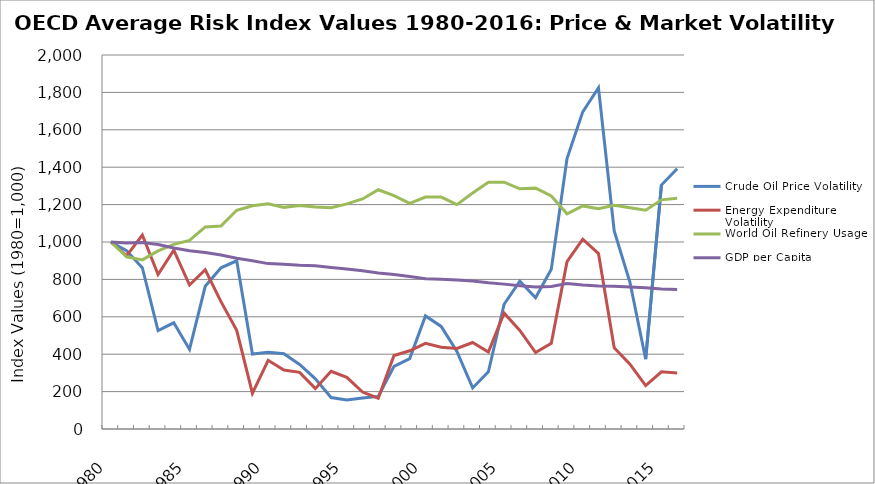
| Category | Crude Oil Price Volatility | Energy Expenditure Volatility | World Oil Refinery Usage | GDP per Capita |
|---|---|---|---|---|
| 1980.0 | 1000 | 1000 | 1000 | 1000 |
| 1981.0 | 953.916 | 925.77 | 920.829 | 994.044 |
| 1982.0 | 862.398 | 1037.249 | 904.555 | 996.844 |
| 1983.0 | 526.431 | 826.283 | 952.628 | 986.886 |
| 1984.0 | 567.974 | 956.754 | 987.079 | 968.412 |
| 1985.0 | 425.535 | 769.851 | 1008.263 | 953.72 |
| 1986.0 | 763.121 | 851.651 | 1080.818 | 943.396 |
| 1987.0 | 861.791 | 681.185 | 1085.462 | 930.903 |
| 1988.0 | 899.666 | 527.476 | 1169.688 | 913.213 |
| 1989.0 | 401.012 | 191.341 | 1194.01 | 899.502 |
| 1990.0 | 410.366 | 367.346 | 1204.902 | 884.449 |
| 1991.0 | 402.585 | 315.634 | 1185.253 | 881.232 |
| 1992.0 | 344.916 | 302.865 | 1194.546 | 875.65 |
| 1993.0 | 268.287 | 215.833 | 1187.561 | 873.465 |
| 1994.0 | 168.252 | 308.366 | 1183.386 | 863.718 |
| 1995.0 | 155.619 | 275.932 | 1203.818 | 855.055 |
| 1996.0 | 166.341 | 197.601 | 1229.978 | 845.744 |
| 1997.0 | 174.477 | 164.82 | 1279.495 | 834.421 |
| 1998.0 | 335.249 | 393.062 | 1248.329 | 826.328 |
| 1999.0 | 376.729 | 418.281 | 1206.159 | 815.903 |
| 2000.0 | 604.661 | 458.023 | 1240.088 | 802.958 |
| 2001.0 | 548.492 | 437.269 | 1240.466 | 800.257 |
| 2002.0 | 414.918 | 430.652 | 1199.96 | 796.819 |
| 2003.0 | 219.555 | 462.531 | 1261.571 | 791.777 |
| 2004.0 | 305.879 | 411.263 | 1319.937 | 782.209 |
| 2005.0 | 667.108 | 619.555 | 1320.154 | 774.759 |
| 2006.0 | 790.236 | 527.21 | 1284.48 | 766.242 |
| 2007.0 | 701.75 | 408.954 | 1288.043 | 759.385 |
| 2008.0 | 854.676 | 458.73 | 1245.961 | 761.68 |
| 2009.0 | 1445.995 | 894.83 | 1150.558 | 778.354 |
| 2010.0 | 1695.842 | 1014.666 | 1193.045 | 769.794 |
| 2011.0 | 1824.866 | 938.059 | 1177.649 | 765.163 |
| 2012.0 | 1059.622 | 433.986 | 1196.241 | 762.774 |
| 2013.0 | 784.364 | 346.919 | 1183.681 | 759.84 |
| 2014.0 | 373.317 | 232.341 | 1170.32 | 755.768 |
| 2015.0 | 1304.371 | 305.782 | 1225.508 | 749.291 |
| 2016.0 | 1392.008 | 299.085 | 1234.229 | 745.436 |